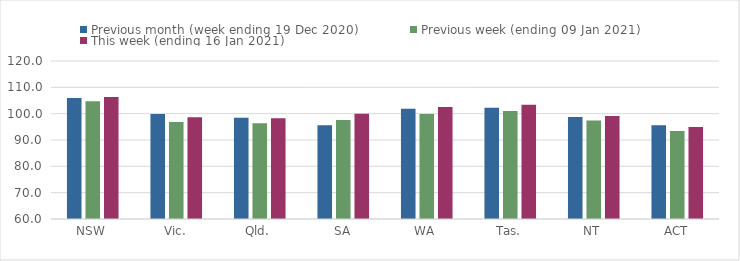
| Category | Previous month (week ending 19 Dec 2020) | Previous week (ending 09 Jan 2021) | This week (ending 16 Jan 2021) |
|---|---|---|---|
| NSW | 105.95 | 104.67 | 106.32 |
| Vic. | 99.83 | 96.86 | 98.66 |
| Qld. | 98.44 | 96.33 | 98.23 |
| SA | 95.58 | 97.55 | 99.95 |
| WA | 101.89 | 99.91 | 102.49 |
| Tas. | 102.21 | 101.01 | 103.37 |
| NT | 98.7 | 97.41 | 99.07 |
| ACT | 95.57 | 93.46 | 94.9 |